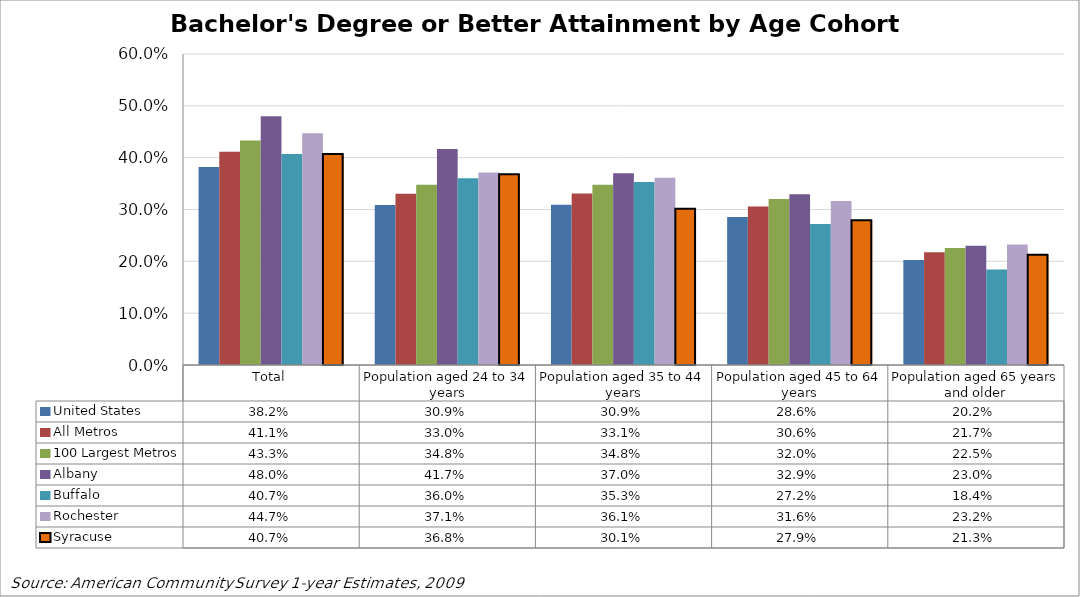
| Category | United States | All Metros | 100 Largest Metros | Albany | Buffalo | Rochester | Syracuse |
|---|---|---|---|---|---|---|---|
| Total | 0.382 | 0.411 | 0.433 | 0.48 | 0.407 | 0.447 | 0.407 |
| Population aged 24 to 34 years | 0.309 | 0.33 | 0.348 | 0.417 | 0.36 | 0.371 | 0.368 |
| Population aged 35 to 44 years | 0.309 | 0.331 | 0.348 | 0.37 | 0.353 | 0.361 | 0.301 |
| Population aged 45 to 64 years | 0.286 | 0.306 | 0.32 | 0.329 | 0.272 | 0.316 | 0.279 |
| Population aged 65 years and older | 0.202 | 0.217 | 0.225 | 0.23 | 0.184 | 0.232 | 0.213 |